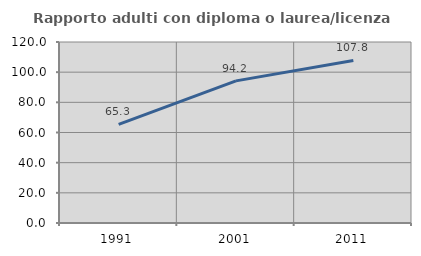
| Category | Rapporto adulti con diploma o laurea/licenza media  |
|---|---|
| 1991.0 | 65.34 |
| 2001.0 | 94.24 |
| 2011.0 | 107.773 |